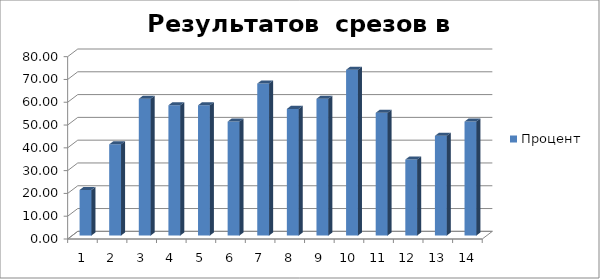
| Category | Процент |
|---|---|
| 0 | 20 |
| 1 | 40 |
| 2 | 60 |
| 3 | 57.143 |
| 4 | 57.143 |
| 5 | 50 |
| 6 | 66.667 |
| 7 | 55.556 |
| 8 | 60 |
| 9 | 72.727 |
| 10 | 53.846 |
| 11 | 33.333 |
| 12 | 43.75 |
| 13 | 50 |